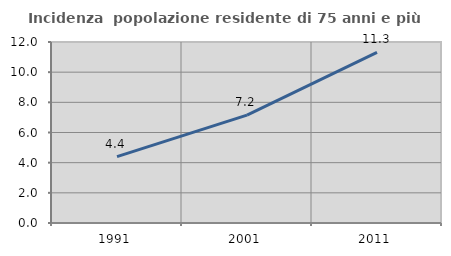
| Category | Incidenza  popolazione residente di 75 anni e più |
|---|---|
| 1991.0 | 4.4 |
| 2001.0 | 7.155 |
| 2011.0 | 11.317 |